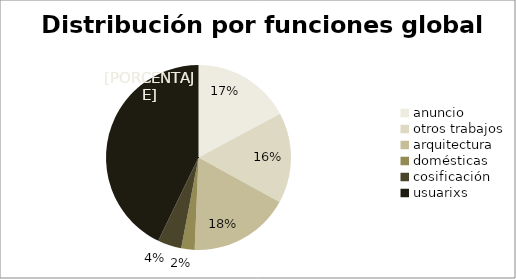
| Category | funciones |
|---|---|
| anuncio | 103 |
| otros trabajos | 95 |
| arquitectura | 106 |
| domésticas | 14 |
| cosificación | 25 |
| usuarixs | 257 |